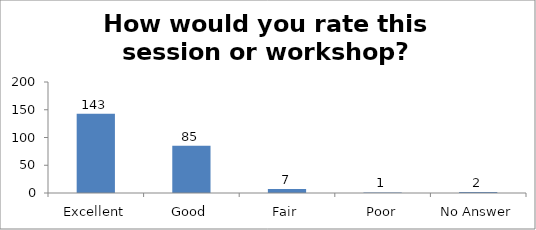
| Category | How would you rate this session or workshop? |
|---|---|
| Excellent | 143 |
| Good | 85 |
| Fair | 7 |
| Poor | 1 |
| No Answer | 2 |